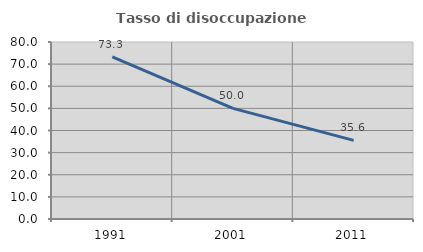
| Category | Tasso di disoccupazione giovanile  |
|---|---|
| 1991.0 | 73.298 |
| 2001.0 | 50 |
| 2011.0 | 35.556 |